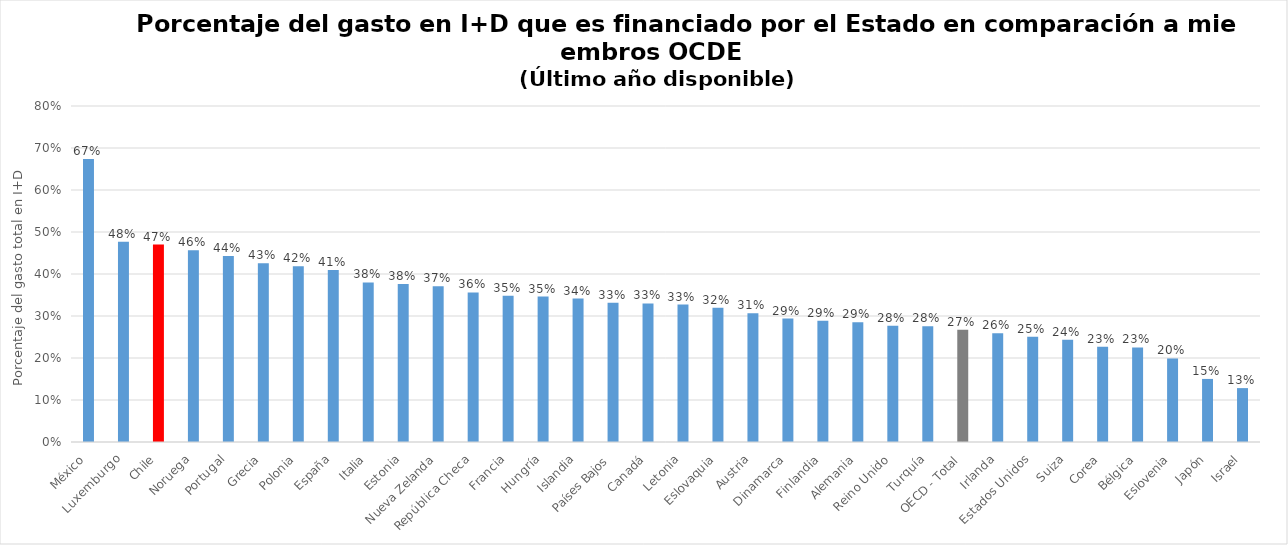
| Category | % Gasto I+D financiado por el Estado |
|---|---|
| México | 0.674 |
| Luxemburgo | 0.477 |
| Chile | 0.47 |
| Noruega | 0.457 |
| Portugal | 0.443 |
| Grecia | 0.426 |
| Polonia | 0.418 |
| España | 0.409 |
| Italia | 0.38 |
| Estonia | 0.376 |
| Nueva Zelanda | 0.371 |
| República Checa | 0.356 |
| Francia | 0.348 |
| Hungría | 0.346 |
| Islandia | 0.342 |
| Países Bajos | 0.331 |
| Canadá | 0.33 |
| Letonia | 0.327 |
| Eslovaquia | 0.319 |
| Austria | 0.307 |
| Dinamarca | 0.294 |
| Finlandia | 0.289 |
| Alemania | 0.285 |
| Reino Unido | 0.277 |
| Turquía | 0.276 |
| OECD - Total | 0.267 |
| Irlanda | 0.259 |
| Estados Unidos | 0.251 |
| Suiza | 0.244 |
| Corea | 0.227 |
| Bélgica | 0.225 |
| Eslovenia | 0.199 |
| Japón | 0.15 |
| Israel | 0.128 |